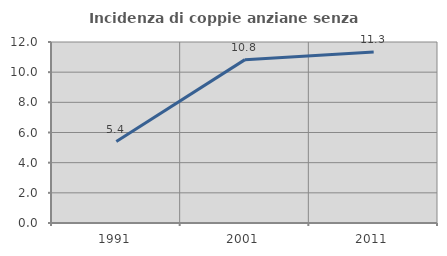
| Category | Incidenza di coppie anziane senza figli  |
|---|---|
| 1991.0 | 5.398 |
| 2001.0 | 10.831 |
| 2011.0 | 11.338 |